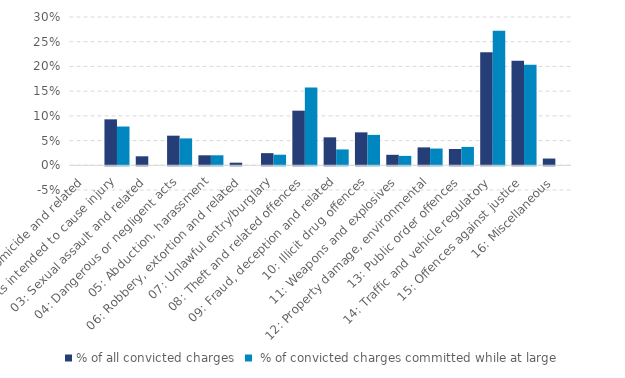
| Category | % of all convicted charges |  % of convicted charges committed while at large |
|---|---|---|
| 01: Homicide and related | 0 | 0 |
| 02: Acts intended to cause injury | 0.093 | 0.078 |
| 03: Sexual assault and related | 0.018 | 0 |
| 04: Dangerous or negligent acts | 0.06 | 0.054 |
| 05: Abduction, harassment | 0.02 | 0.02 |
| 06: Robbery, extortion and related | 0.005 | 0 |
| 07: Unlawful entry/burglary | 0.025 | 0.021 |
| 08: Theft and related offences | 0.111 | 0.157 |
| 09: Fraud, deception and related | 0.057 | 0.032 |
| 10: Illicit drug offences | 0.067 | 0.061 |
| 11: Weapons and explosives | 0.021 | 0.019 |
| 12: Property damage, environmental | 0.036 | 0.034 |
| 13: Public order offences | 0.033 | 0.037 |
| 14: Traffic and vehicle regulatory | 0.229 | 0.272 |
| 15: Offences against justice | 0.211 | 0.204 |
| 16: Miscellaneous | 0.014 | 0 |